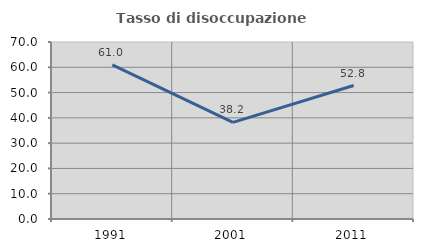
| Category | Tasso di disoccupazione giovanile  |
|---|---|
| 1991.0 | 60.976 |
| 2001.0 | 38.235 |
| 2011.0 | 52.778 |